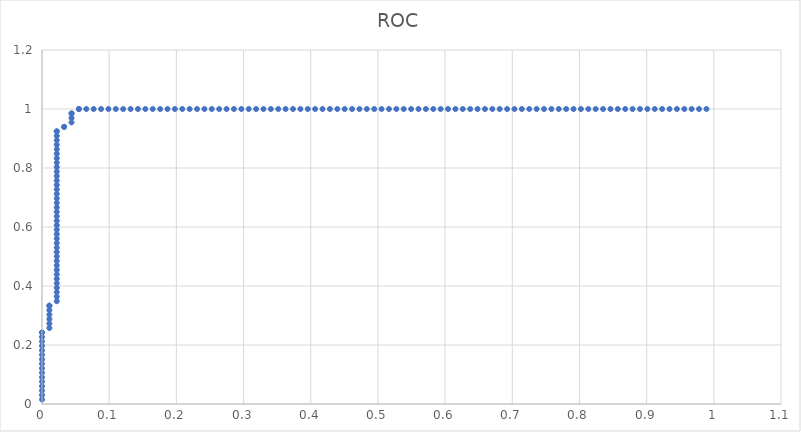
| Category | ROC |
|---|---|
| 0.0 | 0.015 |
| 0.0 | 0.03 |
| 0.0 | 0.045 |
| 0.0 | 0.061 |
| 0.0 | 0.076 |
| 0.0 | 0.091 |
| 0.0 | 0.106 |
| 0.0 | 0.121 |
| 0.0 | 0.136 |
| 0.0 | 0.152 |
| 0.0 | 0.167 |
| 0.0 | 0.182 |
| 0.0 | 0.197 |
| 0.0 | 0.212 |
| 0.0 | 0.227 |
| 0.0 | 0.242 |
| 0.0 | 0.242 |
| 0.01098901098901095 | 0.258 |
| 0.01098901098901095 | 0.273 |
| 0.01098901098901095 | 0.288 |
| 0.01098901098901095 | 0.303 |
| 0.01098901098901095 | 0.318 |
| 0.01098901098901095 | 0.333 |
| 0.01098901098901095 | 0.333 |
| 0.02197802197802201 | 0.348 |
| 0.02197802197802201 | 0.364 |
| 0.02197802197802201 | 0.379 |
| 0.02197802197802201 | 0.394 |
| 0.02197802197802201 | 0.409 |
| 0.02197802197802201 | 0.424 |
| 0.02197802197802201 | 0.439 |
| 0.02197802197802201 | 0.455 |
| 0.02197802197802201 | 0.47 |
| 0.02197802197802201 | 0.485 |
| 0.02197802197802201 | 0.5 |
| 0.02197802197802201 | 0.515 |
| 0.02197802197802201 | 0.53 |
| 0.02197802197802201 | 0.545 |
| 0.02197802197802201 | 0.561 |
| 0.02197802197802201 | 0.576 |
| 0.02197802197802201 | 0.591 |
| 0.02197802197802201 | 0.606 |
| 0.02197802197802201 | 0.621 |
| 0.02197802197802201 | 0.636 |
| 0.02197802197802201 | 0.652 |
| 0.02197802197802201 | 0.667 |
| 0.02197802197802201 | 0.682 |
| 0.02197802197802201 | 0.697 |
| 0.02197802197802201 | 0.712 |
| 0.02197802197802201 | 0.727 |
| 0.02197802197802201 | 0.742 |
| 0.02197802197802201 | 0.758 |
| 0.02197802197802201 | 0.773 |
| 0.02197802197802201 | 0.788 |
| 0.02197802197802201 | 0.803 |
| 0.02197802197802201 | 0.818 |
| 0.02197802197802201 | 0.833 |
| 0.02197802197802201 | 0.848 |
| 0.02197802197802201 | 0.864 |
| 0.02197802197802201 | 0.879 |
| 0.02197802197802201 | 0.894 |
| 0.02197802197802201 | 0.909 |
| 0.02197802197802201 | 0.924 |
| 0.02197802197802201 | 0.924 |
| 0.03296703296703296 | 0.939 |
| 0.03296703296703296 | 0.939 |
| 0.04395604395604391 | 0.955 |
| 0.04395604395604391 | 0.97 |
| 0.04395604395604391 | 0.985 |
| 0.04395604395604391 | 0.985 |
| 0.05494505494505497 | 1 |
| 0.05494505494505497 | 1 |
| 0.06593406593406592 | 1 |
| 0.07692307692307687 | 1 |
| 0.08791208791208793 | 1 |
| 0.09890109890109888 | 1 |
| 0.10989010989010994 | 1 |
| 0.1208791208791209 | 1 |
| 0.13186813186813184 | 1 |
| 0.1428571428571429 | 1 |
| 0.15384615384615385 | 1 |
| 0.1648351648351648 | 1 |
| 0.17582417582417587 | 1 |
| 0.18681318681318682 | 1 |
| 0.19780219780219777 | 1 |
| 0.20879120879120883 | 1 |
| 0.21978021978021978 | 1 |
| 0.23076923076923073 | 1 |
| 0.2417582417582418 | 1 |
| 0.25274725274725274 | 1 |
| 0.2637362637362637 | 1 |
| 0.27472527472527475 | 1 |
| 0.2857142857142857 | 1 |
| 0.29670329670329665 | 1 |
| 0.3076923076923077 | 1 |
| 0.31868131868131866 | 1 |
| 0.3296703296703297 | 1 |
| 0.34065934065934067 | 1 |
| 0.3516483516483516 | 1 |
| 0.3626373626373627 | 1 |
| 0.37362637362637363 | 1 |
| 0.3846153846153846 | 1 |
| 0.39560439560439564 | 1 |
| 0.4065934065934066 | 1 |
| 0.41758241758241754 | 1 |
| 0.4285714285714286 | 1 |
| 0.43956043956043955 | 1 |
| 0.4505494505494505 | 1 |
| 0.46153846153846156 | 1 |
| 0.4725274725274725 | 1 |
| 0.48351648351648346 | 1 |
| 0.4945054945054945 | 1 |
| 0.5054945054945055 | 1 |
| 0.5164835164835164 | 1 |
| 0.5274725274725275 | 1 |
| 0.5384615384615384 | 1 |
| 0.5494505494505495 | 1 |
| 0.5604395604395604 | 1 |
| 0.5714285714285714 | 1 |
| 0.5824175824175823 | 1 |
| 0.5934065934065934 | 1 |
| 0.6043956043956045 | 1 |
| 0.6153846153846154 | 1 |
| 0.6263736263736264 | 1 |
| 0.6373626373626373 | 1 |
| 0.6483516483516483 | 1 |
| 0.6593406593406593 | 1 |
| 0.6703296703296704 | 1 |
| 0.6813186813186813 | 1 |
| 0.6923076923076923 | 1 |
| 0.7032967032967032 | 1 |
| 0.7142857142857143 | 1 |
| 0.7252747252747253 | 1 |
| 0.7362637362637363 | 1 |
| 0.7472527472527473 | 1 |
| 0.7582417582417582 | 1 |
| 0.7692307692307692 | 1 |
| 0.7802197802197802 | 1 |
| 0.7912087912087912 | 1 |
| 0.8021978021978022 | 1 |
| 0.8131868131868132 | 1 |
| 0.8241758241758241 | 1 |
| 0.8351648351648352 | 1 |
| 0.8461538461538461 | 1 |
| 0.8571428571428572 | 1 |
| 0.8681318681318682 | 1 |
| 0.8791208791208791 | 1 |
| 0.8901098901098901 | 1 |
| 0.9010989010989011 | 1 |
| 0.9120879120879121 | 1 |
| 0.9230769230769231 | 1 |
| 0.9340659340659341 | 1 |
| 0.945054945054945 | 1 |
| 0.9560439560439561 | 1 |
| 0.967032967032967 | 1 |
| 0.978021978021978 | 1 |
| 0.989010989010989 | 1 |